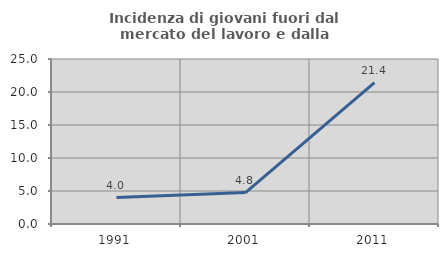
| Category | Incidenza di giovani fuori dal mercato del lavoro e dalla formazione  |
|---|---|
| 1991.0 | 4 |
| 2001.0 | 4.762 |
| 2011.0 | 21.429 |